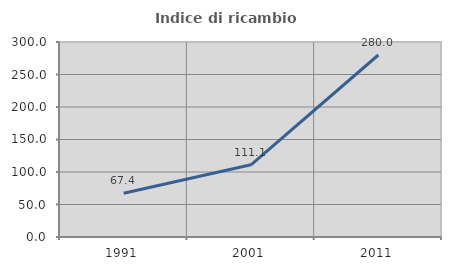
| Category | Indice di ricambio occupazionale  |
|---|---|
| 1991.0 | 67.442 |
| 2001.0 | 111.111 |
| 2011.0 | 280 |